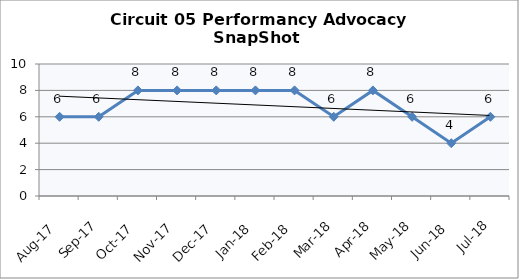
| Category | Circuit 05 |
|---|---|
| Aug-17 | 6 |
| Sep-17 | 6 |
| Oct-17 | 8 |
| Nov-17 | 8 |
| Dec-17 | 8 |
| Jan-18 | 8 |
| Feb-18 | 8 |
| Mar-18 | 6 |
| Apr-18 | 8 |
| May-18 | 6 |
| Jun-18 | 4 |
| Jul-18 | 6 |